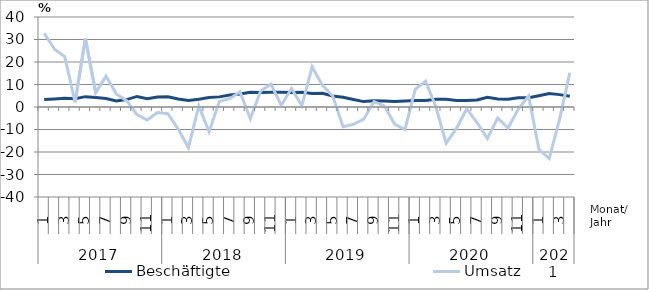
| Category | Beschäftigte | Umsatz |
|---|---|---|
| 0 | 3.3 | 32.8 |
| 1 | 3.6 | 25.7 |
| 2 | 3.9 | 22.4 |
| 3 | 3.7 | 2.1 |
| 4 | 4.6 | 30.4 |
| 5 | 4.2 | 6.4 |
| 6 | 3.8 | 13.7 |
| 7 | 2.7 | 5.8 |
| 8 | 3.3 | 2.8 |
| 9 | 4.7 | -3.4 |
| 10 | 3.7 | -5.8 |
| 11 | 4.4 | -2.5 |
| 12 | 4.5 | -3 |
| 13 | 3.6 | -9.8 |
| 14 | 2.9 | -18.1 |
| 15 | 3.4 | 0.5 |
| 16 | 4.2 | -11 |
| 17 | 4.5 | 2.5 |
| 18 | 5.3 | 3.7 |
| 19 | 5.8 | 6.8 |
| 20 | 6.6 | -5.2 |
| 21 | 6.5 | 7.1 |
| 22 | 6.6 | 10.1 |
| 23 | 6.6 | 0.8 |
| 24 | 6.4 | 8.2 |
| 25 | 6.5 | 0.6 |
| 26 | 6 | 17.8 |
| 27 | 6.1 | 9.6 |
| 28 | 4.9 | 4.9 |
| 29 | 4.3 | -8.8 |
| 30 | 3.3 | -7.7 |
| 31 | 2.4 | -5.4 |
| 32 | 2.8 | 2.4 |
| 33 | 2.7 | 0.5 |
| 34 | 2.5 | -7.6 |
| 35 | 2.7 | -10 |
| 36 | 2.9 | 7.8 |
| 37 | 2.9 | 11.5 |
| 38 | 3.4 | 0.1 |
| 39 | 3.4 | -16.1 |
| 40 | 2.9 | -9.5 |
| 41 | 2.9 | -0.8 |
| 42 | 3.1 | -6.9 |
| 43 | 4.3 | -14 |
| 44 | 3.6 | -4.9 |
| 45 | 3.4 | -9.4 |
| 46 | 4.1 | -0.9 |
| 47 | 4.1 | 4.9 |
| 48 | 5 | -18.8 |
| 49 | 6 | -22.9 |
| 50 | 5.5 | -5.5 |
| 51 | 4.8 | 15.2 |